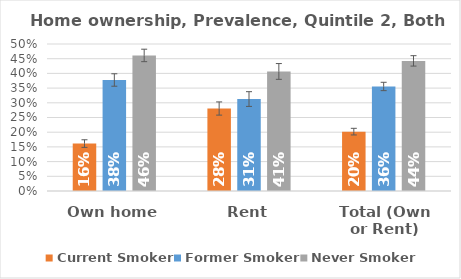
| Category | Current Smoker | Former Smoker | Never Smoker |
|---|---|---|---|
| Own home | 0.161 | 0.378 | 0.461 |
| Rent | 0.281 | 0.313 | 0.407 |
| Total (Own or Rent) | 0.202 | 0.356 | 0.443 |